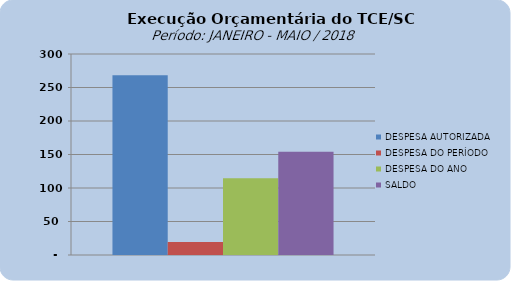
| Category | DESPESA AUTORIZADA | DESPESA DO PERÍODO | DESPESA DO ANO | SALDO |
|---|---|---|---|---|
| 0 | 268393763.32 | 19320026.73 | 114416042.45 | 153977720.87 |